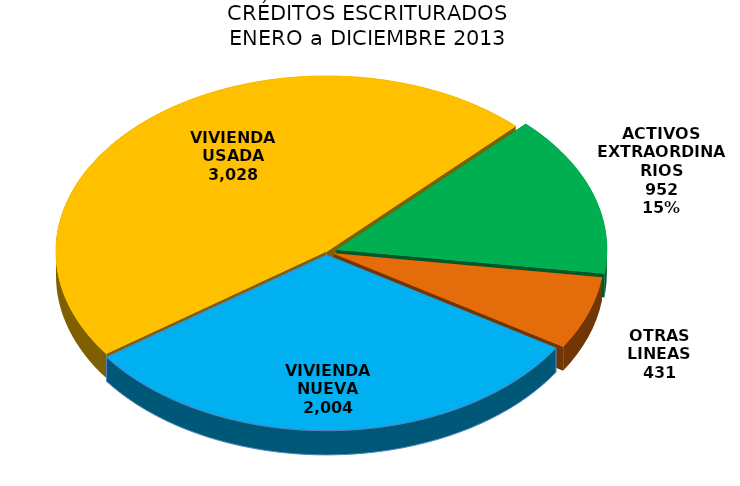
| Category | Series 0 |
|---|---|
| VIVIENDA NUEVA | 2004 |
| VIVIENDA USADA | 3028 |
| ACTIVOS EXTRAORDINARIOS | 952 |
| OTRAS LINEAS | 431 |